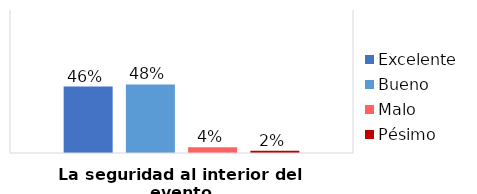
| Category | Excelente | Bueno | Malo | Pésimo |
|---|---|---|---|---|
| La seguridad al interior del evento | 0.464 | 0.48 | 0.041 | 0.015 |